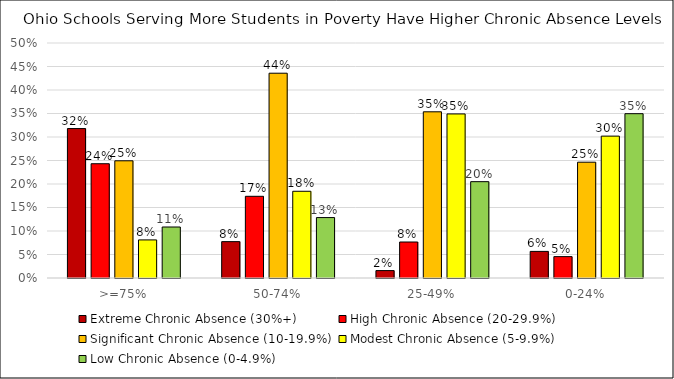
| Category | Extreme Chronic Absence (30%+) | High Chronic Absence (20-29.9%) | Significant Chronic Absence (10-19.9%) | Modest Chronic Absence (5-9.9%) | Low Chronic Absence (0-4.9%) |
|---|---|---|---|---|---|
| >=75% | 0.318 | 0.243 | 0.249 | 0.081 | 0.108 |
| 50-74% | 0.077 | 0.174 | 0.436 | 0.185 | 0.129 |
| 25-49% | 0.016 | 0.077 | 0.354 | 0.349 | 0.205 |
| 0-24% | 0.057 | 0.046 | 0.246 | 0.302 | 0.35 |